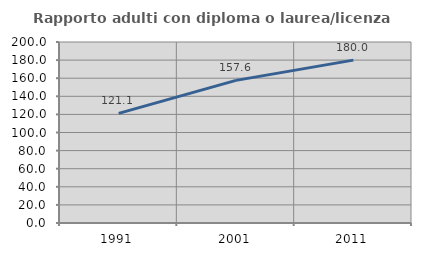
| Category | Rapporto adulti con diploma o laurea/licenza media  |
|---|---|
| 1991.0 | 121.072 |
| 2001.0 | 157.588 |
| 2011.0 | 179.96 |